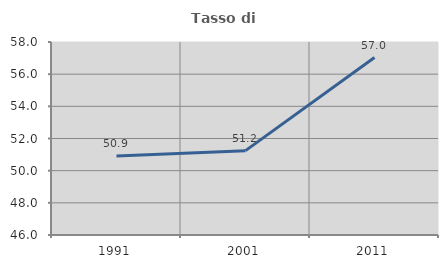
| Category | Tasso di occupazione   |
|---|---|
| 1991.0 | 50.915 |
| 2001.0 | 51.245 |
| 2011.0 | 57.035 |